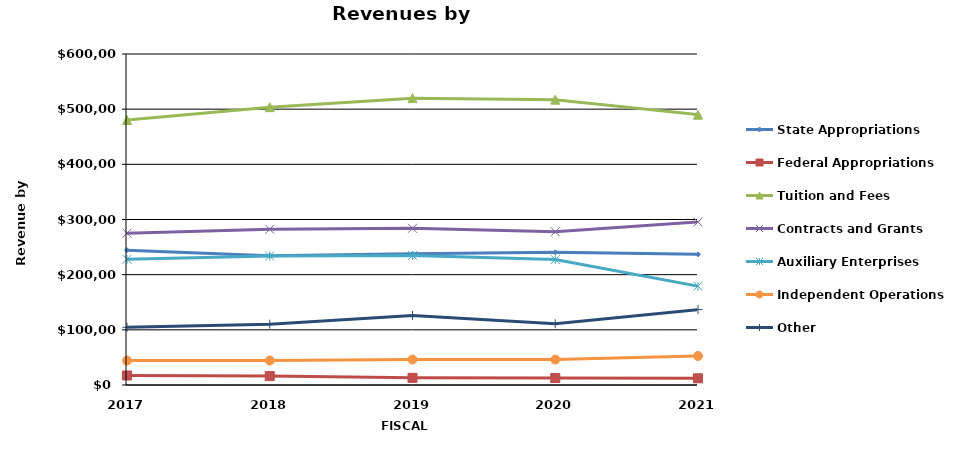
| Category | State Appropriations | Federal Appropriations | Tuition and Fees | Contracts and Grants | Auxiliary Enterprises | Independent Operations | Other |
|---|---|---|---|---|---|---|---|
| 2017.0 | 244458 | 17255 | 480293 | 275261 | 227892 | 44315 | 104559 |
| 2018.0 | 234396 | 16158 | 503619 | 282266 | 233870 | 44335 | 110270 |
| 2019.0 | 237884 | 12972 | 520006 | 284080 | 234846 | 46139 | 125959 |
| 2020.0 | 240526 | 12694 | 517257 | 277630 | 227374 | 45999 | 111100 |
| 2021.0 | 236784 | 12158 | 489989 | 295564 | 179212 | 52576 | 136711 |